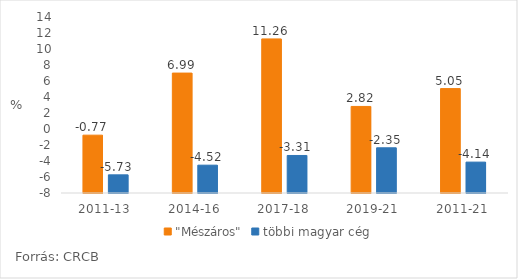
| Category | "Mészáros" | többi magyar cég |
|---|---|---|
| 2011-13 | -0.77 | -5.73 |
| 2014-16 | 6.99 | -4.52 |
| 2017-18 | 11.26 | -3.31 |
| 2019-21 | 2.82 | -2.35 |
| 2011-21 | 5.05 | -4.14 |